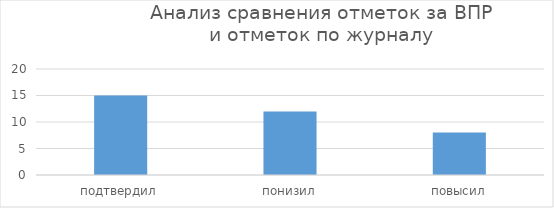
| Category | Series 0 |
|---|---|
| подтвердил | 15 |
| понизил | 12 |
| повысил | 8 |